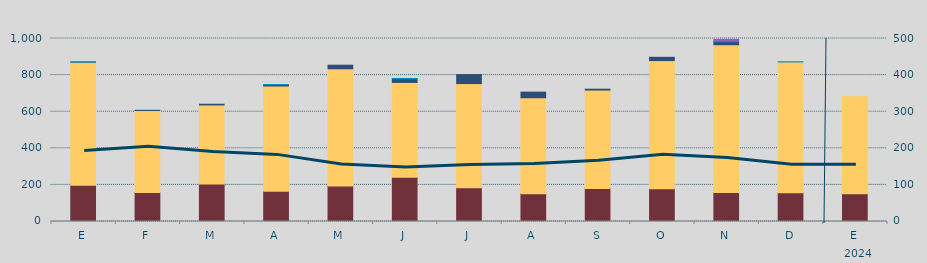
| Category | Carbón | Ciclo Combinado | Cogeneración | Consumo Bombeo | Eólica | Hidráulica | Otras Renovables | Solar fotovoltaica | Solar térmica | Turbinación bombeo | Nuclear |
|---|---|---|---|---|---|---|---|---|---|---|---|
| E | 198667 | 672278.9 | 0 | 600 | 0 | 167.2 | 0 | 0 | 0 | 0 | 0 |
| F | 158446.8 | 448230.6 | 0 | 876 | 0 | 0 | 0 | 0 | 0 | 0 | 0 |
| M | 205470 | 431456.4 | 0 | 3844 | 0 | 0 | 0 | 0 | 0 | 0 | 0 |
| A | 165579 | 574881.6 | 0 | 7190 | 0 | 954 | 0 | 0 | 0 | 0 | 0 |
| M | 194640 | 639265.9 | 701 | 19503.3 | 0 | 0 | 0 | 0 | 0 | 0 | 0 |
| J | 241510 | 518484.5 | 0 | 20561.8 | 0 | 350.1 | 0 | 0 | 0 | 0 | 0 |
| J | 184698 | 569012.5 | 0 | 49075.9 | 0 | 0 | 0 | 0 | 0 | 0 | 0 |
| A | 151988 | 524255.8 | 0 | 30631.6 | 0 | 0 | 0 | 0 | 0 | 0 | 0 |
| S | 180894 | 537393.3 | 0 | 4681.3 | 0 | 0 | 0 | 0 | 0 | 0 | 0 |
| O | 179348.9 | 699577 | 400 | 17036.6 | 0 | 0 | 1381 | 0 | 0 | 0 | 0 |
| N | 158625 | 806211.9 | 1123.9 | 16397.2 | 0 | 180 | 12732 | 0 | 0 | 0 | 0 |
| D | 156652.5 | 714991.3 | 0 | 0 | 0 | 1170 | 0 | 0 | 0 | 0 | 0 |
| E | 152061 | 529633 | 0 | 0 | 0 | 0 | 0 | 0 | 0 | 0 | 0 |